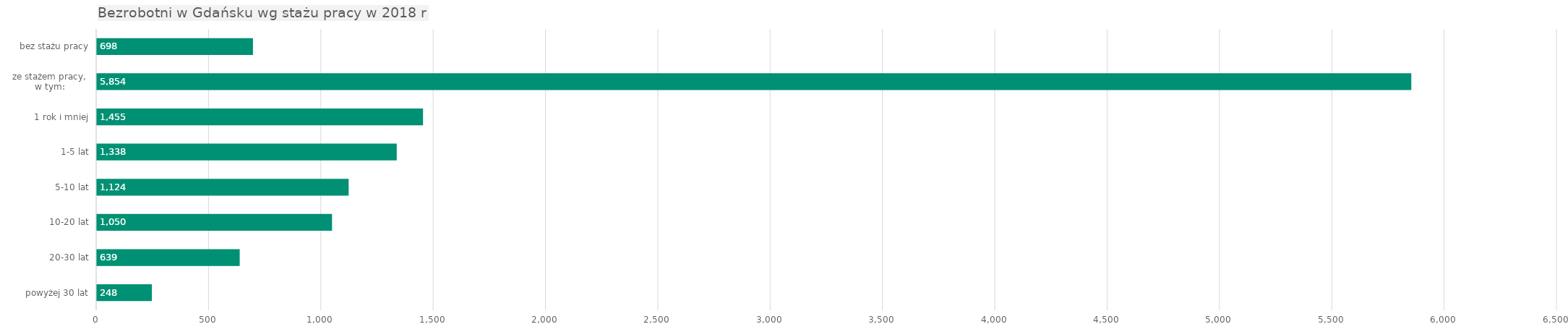
| Category | Series 0 |
|---|---|
| bez stażu pracy | 698 |
| ze stażem pracy,
w tym: | 5854 |
|      1 rok i mniej | 1455 |
|      1-5 lat | 1338 |
|      5-10 lat | 1124 |
|      10-20 lat | 1050 |
|      20-30 lat | 639 |
|      powyżej 30 lat | 248 |